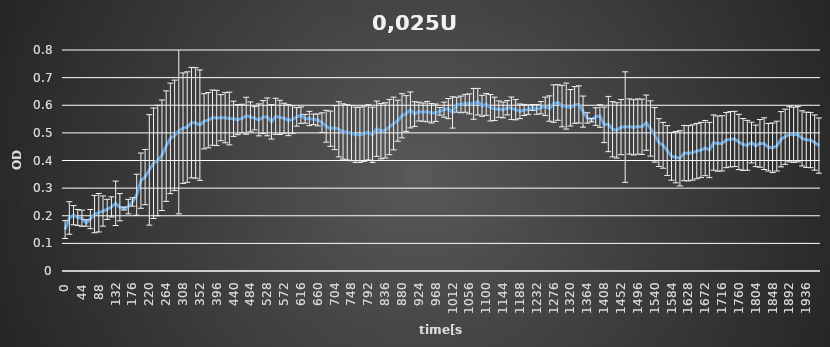
| Category | 0,025U |
|---|---|
| 0.0 | 0.15 |
| 11.0 | 0.192 |
| 22.0 | 0.202 |
| 33.0 | 0.194 |
| 44.0 | 0.191 |
| 55.0 | 0.174 |
| 66.0 | 0.188 |
| 77.0 | 0.206 |
| 88.0 | 0.211 |
| 99.0 | 0.217 |
| 110.0 | 0.223 |
| 121.0 | 0.232 |
| 132.0 | 0.245 |
| 143.0 | 0.231 |
| 154.0 | 0.226 |
| 165.0 | 0.233 |
| 176.0 | 0.25 |
| 187.0 | 0.276 |
| 198.0 | 0.327 |
| 209.0 | 0.34 |
| 220.0 | 0.366 |
| 231.0 | 0.39 |
| 242.0 | 0.4 |
| 253.0 | 0.419 |
| 264.0 | 0.452 |
| 275.0 | 0.48 |
| 286.0 | 0.491 |
| 297.0 | 0.507 |
| 308.0 | 0.517 |
| 319.0 | 0.521 |
| 330.0 | 0.537 |
| 341.0 | 0.536 |
| 352.0 | 0.528 |
| 363.0 | 0.542 |
| 374.0 | 0.546 |
| 385.0 | 0.555 |
| 396.0 | 0.554 |
| 407.0 | 0.555 |
| 418.0 | 0.555 |
| 429.0 | 0.552 |
| 440.0 | 0.551 |
| 451.0 | 0.548 |
| 462.0 | 0.552 |
| 473.0 | 0.562 |
| 484.0 | 0.558 |
| 495.0 | 0.553 |
| 506.0 | 0.547 |
| 517.0 | 0.557 |
| 528.0 | 0.558 |
| 539.0 | 0.54 |
| 550.0 | 0.56 |
| 561.0 | 0.556 |
| 572.0 | 0.553 |
| 583.0 | 0.546 |
| 594.0 | 0.548 |
| 605.0 | 0.558 |
| 616.0 | 0.564 |
| 627.0 | 0.551 |
| 638.0 | 0.552 |
| 649.0 | 0.549 |
| 660.0 | 0.547 |
| 671.0 | 0.537 |
| 682.0 | 0.524 |
| 693.0 | 0.515 |
| 704.0 | 0.519 |
| 715.0 | 0.513 |
| 726.0 | 0.505 |
| 737.0 | 0.502 |
| 748.0 | 0.499 |
| 759.0 | 0.493 |
| 770.0 | 0.493 |
| 781.0 | 0.497 |
| 792.0 | 0.502 |
| 803.0 | 0.493 |
| 814.0 | 0.515 |
| 825.0 | 0.506 |
| 836.0 | 0.509 |
| 847.0 | 0.521 |
| 858.0 | 0.534 |
| 869.0 | 0.544 |
| 880.0 | 0.562 |
| 891.0 | 0.57 |
| 902.0 | 0.583 |
| 913.0 | 0.568 |
| 924.0 | 0.577 |
| 935.0 | 0.575 |
| 946.0 | 0.577 |
| 957.0 | 0.571 |
| 968.0 | 0.573 |
| 979.0 | 0.578 |
| 990.0 | 0.584 |
| 1001.0 | 0.588 |
| 1012.0 | 0.574 |
| 1023.0 | 0.602 |
| 1034.0 | 0.603 |
| 1045.0 | 0.607 |
| 1056.0 | 0.605 |
| 1067.0 | 0.605 |
| 1078.0 | 0.613 |
| 1089.0 | 0.598 |
| 1100.0 | 0.603 |
| 1111.0 | 0.591 |
| 1122.0 | 0.587 |
| 1133.0 | 0.586 |
| 1144.0 | 0.583 |
| 1155.0 | 0.591 |
| 1166.0 | 0.589 |
| 1177.0 | 0.584 |
| 1188.0 | 0.578 |
| 1199.0 | 0.583 |
| 1210.0 | 0.584 |
| 1221.0 | 0.592 |
| 1232.0 | 0.585 |
| 1243.0 | 0.591 |
| 1254.0 | 0.596 |
| 1265.0 | 0.588 |
| 1276.0 | 0.606 |
| 1287.0 | 0.61 |
| 1298.0 | 0.597 |
| 1309.0 | 0.597 |
| 1320.0 | 0.591 |
| 1331.0 | 0.601 |
| 1342.0 | 0.603 |
| 1353.0 | 0.577 |
| 1364.0 | 0.554 |
| 1375.0 | 0.546 |
| 1386.0 | 0.559 |
| 1397.0 | 0.561 |
| 1408.0 | 0.529 |
| 1419.0 | 0.532 |
| 1430.0 | 0.513 |
| 1441.0 | 0.509 |
| 1452.0 | 0.521 |
| 1463.0 | 0.521 |
| 1474.0 | 0.523 |
| 1485.0 | 0.52 |
| 1496.0 | 0.523 |
| 1507.0 | 0.522 |
| 1518.0 | 0.537 |
| 1529.0 | 0.516 |
| 1540.0 | 0.493 |
| 1551.0 | 0.465 |
| 1562.0 | 0.455 |
| 1573.0 | 0.436 |
| 1584.0 | 0.415 |
| 1595.0 | 0.412 |
| 1606.0 | 0.408 |
| 1617.0 | 0.427 |
| 1628.0 | 0.426 |
| 1639.0 | 0.429 |
| 1650.0 | 0.434 |
| 1661.0 | 0.438 |
| 1672.0 | 0.445 |
| 1683.0 | 0.438 |
| 1694.0 | 0.465 |
| 1705.0 | 0.461 |
| 1716.0 | 0.462 |
| 1727.0 | 0.474 |
| 1738.0 | 0.477 |
| 1749.0 | 0.478 |
| 1760.0 | 0.467 |
| 1771.0 | 0.458 |
| 1782.0 | 0.455 |
| 1793.0 | 0.465 |
| 1804.0 | 0.453 |
| 1815.0 | 0.462 |
| 1826.0 | 0.461 |
| 1837.0 | 0.448 |
| 1848.0 | 0.446 |
| 1859.0 | 0.452 |
| 1870.0 | 0.477 |
| 1881.0 | 0.486 |
| 1892.0 | 0.495 |
| 1903.0 | 0.493 |
| 1914.0 | 0.495 |
| 1925.0 | 0.48 |
| 1936.0 | 0.475 |
| 1947.0 | 0.474 |
| 1958.0 | 0.465 |
| 1969.0 | 0.454 |